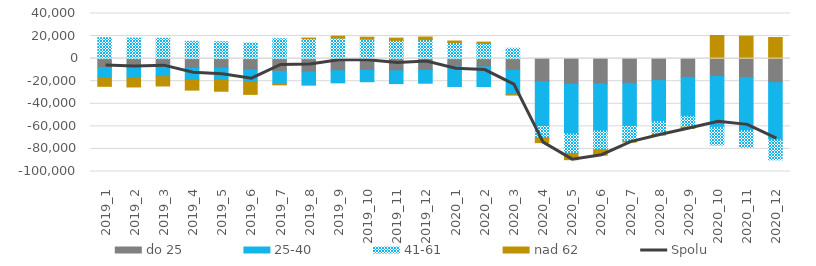
| Category | do 25 | 25-40 | 41-61 | nad 62 |
|---|---|---|---|---|
| 2019_1 | -7840 | -9062 | 18552 | -7617 |
| 2019_2 | -7787 | -9397 | 18166 | -7918 |
| 2019_3 | -7259 | -8740 | 18015 | -8220 |
| 2019_4 | -8573 | -10161 | 15343 | -9151 |
| 2019_5 | -8513 | -10667 | 14994 | -9700 |
| 2019_6 | -10109 | -11020 | 13945 | -10518 |
| 2019_7 | -11313 | -10985 | 17626 | -949 |
| 2019_8 | -11859 | -11630 | 17567 | 672 |
| 2019_9 | -10704 | -10734 | 18225 | 1680 |
| 2019_10 | -10295 | -10161 | 17199 | 1815 |
| 2019_11 | -10810 | -11305 | 16240 | 1942 |
| 2019_12 | -10302 | -11481 | 16706 | 2452 |
| 2020_1 | -7459 | -17199 | 14243 | 1388 |
| 2020_2 | -7369 | -17394 | 13500 | 1147 |
| 2020_3 | -10196 | -21686 | 9199 | -353 |
| 2020_4 | -20549 | -39598 | -9916 | -4390 |
| 2020_5 | -22546 | -44239 | -17148 | -5585 |
| 2020_6 | -22342 | -41757 | -16602 | -4884 |
| 2020_7 | -21862 | -38241 | -13229 | -589 |
| 2020_8 | -19507 | -36153 | -11577 | -479 |
| 2020_9 | -16612 | -34506 | -9583 | -1127 |
| 2020_10 | -15761 | -45128 | -15623 | 20517 |
| 2020_11 | -16913 | -46756 | -14948 | 19960 |
| 2020_12 | -21263 | -50722 | -17645 | 18721 |